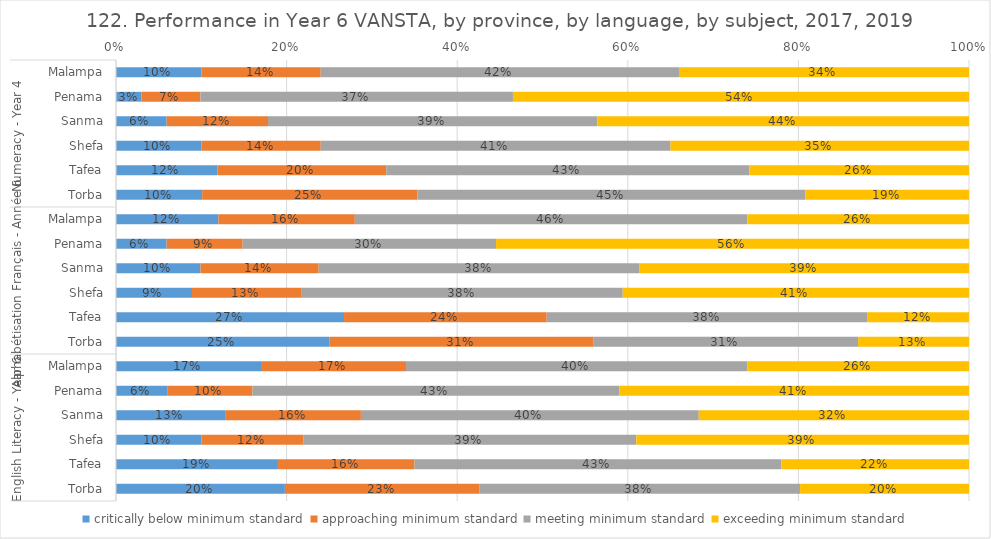
| Category | critically below minimum standard | approaching minimum standard | meeting minimum standard | exceeding minimum standard |
|---|---|---|---|---|
| 0 | 0.1 | 0.14 | 0.42 | 0.34 |
| 1 | 0.03 | 0.07 | 0.37 | 0.54 |
| 2 | 0.06 | 0.12 | 0.39 | 0.44 |
| 3 | 0.1 | 0.14 | 0.41 | 0.35 |
| 4 | 0.12 | 0.2 | 0.43 | 0.26 |
| 5 | 0.1 | 0.25 | 0.45 | 0.19 |
| 6 | 0.12 | 0.16 | 0.46 | 0.26 |
| 7 | 0.06 | 0.09 | 0.3 | 0.56 |
| 8 | 0.1 | 0.14 | 0.38 | 0.39 |
| 9 | 0.09 | 0.13 | 0.38 | 0.41 |
| 10 | 0.27 | 0.24 | 0.38 | 0.12 |
| 11 | 0.25 | 0.31 | 0.31 | 0.13 |
| 12 | 0.17 | 0.17 | 0.4 | 0.26 |
| 13 | 0.06 | 0.1 | 0.43 | 0.41 |
| 14 | 0.13 | 0.16 | 0.4 | 0.32 |
| 15 | 0.1 | 0.12 | 0.39 | 0.39 |
| 16 | 0.19 | 0.16 | 0.43 | 0.22 |
| 17 | 0.2 | 0.23 | 0.38 | 0.2 |